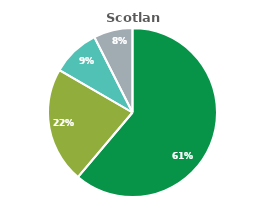
| Category | Scotland |
|---|---|
| ASHP | 10306 |
| Biomass | 3738 |
| GSHP | 1548 |
| Solar Thermal | 1256 |